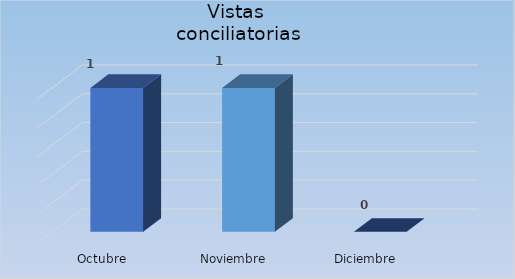
| Category | Vistas 
Conciliatorias |
|---|---|
| Octubre | 1 |
| Noviembre | 1 |
| Diciembre | 0 |